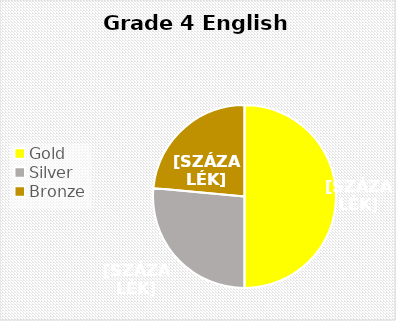
| Category | Series 0 |
|---|---|
| Gold | 17 |
| Silver | 9 |
| Bronze  | 8 |